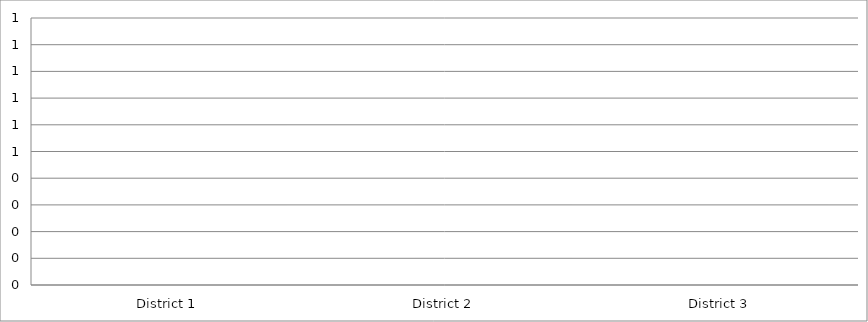
| Category | CO2 (kg/yr) |
|---|---|
| District 1 | 0 |
| District 2 | 0 |
| District 3 | 0 |